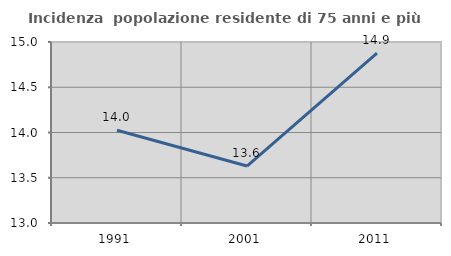
| Category | Incidenza  popolazione residente di 75 anni e più |
|---|---|
| 1991.0 | 14.026 |
| 2001.0 | 13.629 |
| 2011.0 | 14.876 |